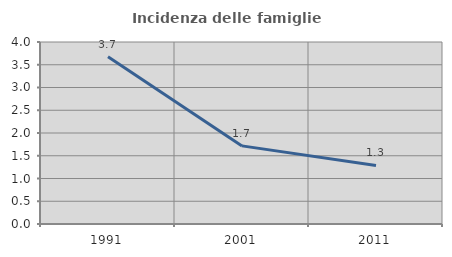
| Category | Incidenza delle famiglie numerose |
|---|---|
| 1991.0 | 3.677 |
| 2001.0 | 1.717 |
| 2011.0 | 1.286 |